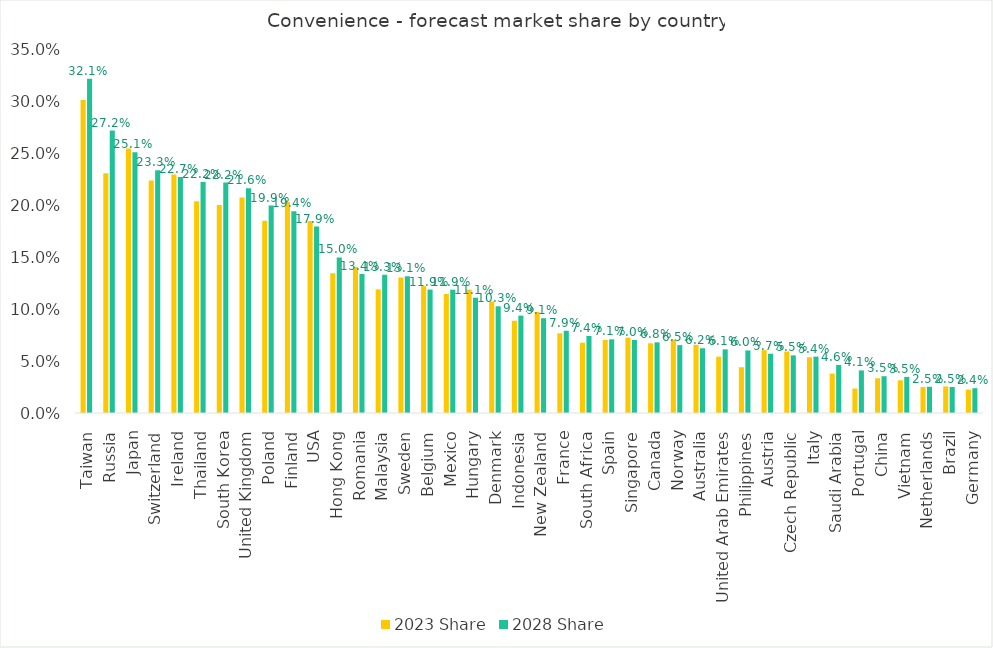
| Category | 2023 Share | 2028 Share |
|---|---|---|
| Taiwan | 0.301 | 0.321 |
| Russia | 0.23 | 0.272 |
| Japan | 0.254 | 0.251 |
| Switzerland | 0.223 | 0.233 |
| Ireland | 0.229 | 0.227 |
| Thailand | 0.204 | 0.222 |
| South Korea | 0.2 | 0.222 |
| United Kingdom | 0.207 | 0.216 |
| Poland | 0.185 | 0.199 |
| Finland | 0.203 | 0.194 |
| USA | 0.185 | 0.179 |
| Hong Kong | 0.134 | 0.15 |
| Romania | 0.141 | 0.134 |
| Malaysia | 0.119 | 0.133 |
| Sweden | 0.13 | 0.131 |
| Belgium | 0.122 | 0.119 |
| Mexico | 0.114 | 0.119 |
| Hungary | 0.119 | 0.111 |
| Denmark | 0.107 | 0.103 |
| Indonesia | 0.089 | 0.094 |
| New Zealand | 0.097 | 0.091 |
| France | 0.077 | 0.079 |
| South Africa | 0.068 | 0.074 |
| Spain | 0.07 | 0.071 |
| Singapore | 0.072 | 0.07 |
| Canada | 0.067 | 0.068 |
| Norway | 0.071 | 0.065 |
| Australia | 0.066 | 0.062 |
| United Arab Emirates | 0.054 | 0.061 |
| Philippines | 0.044 | 0.06 |
| Austria | 0.06 | 0.057 |
| Czech Republic | 0.059 | 0.055 |
| Italy | 0.054 | 0.054 |
| Saudi Arabia | 0.038 | 0.046 |
| Portugal | 0.024 | 0.041 |
| China | 0.033 | 0.035 |
| Vietnam | 0.031 | 0.035 |
| Netherlands | 0.025 | 0.025 |
| Brazil | 0.026 | 0.025 |
| Germany | 0.023 | 0.024 |